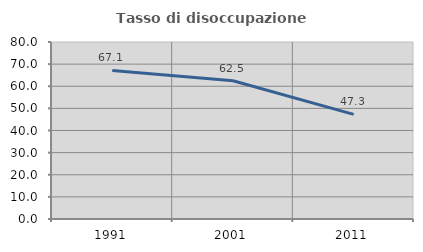
| Category | Tasso di disoccupazione giovanile  |
|---|---|
| 1991.0 | 67.143 |
| 2001.0 | 62.5 |
| 2011.0 | 47.312 |